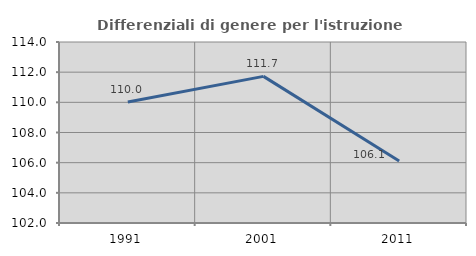
| Category | Differenziali di genere per l'istruzione superiore |
|---|---|
| 1991.0 | 110.017 |
| 2001.0 | 111.721 |
| 2011.0 | 106.109 |